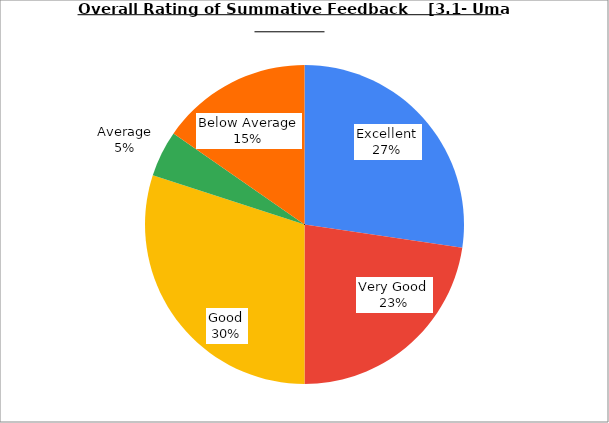
| Category | Series 0 |
|---|---|
| Excellent | 27.333 |
| Very Good | 22.667 |
| Good | 30 |
| Average | 4.667 |
| Below Average | 15.333 |